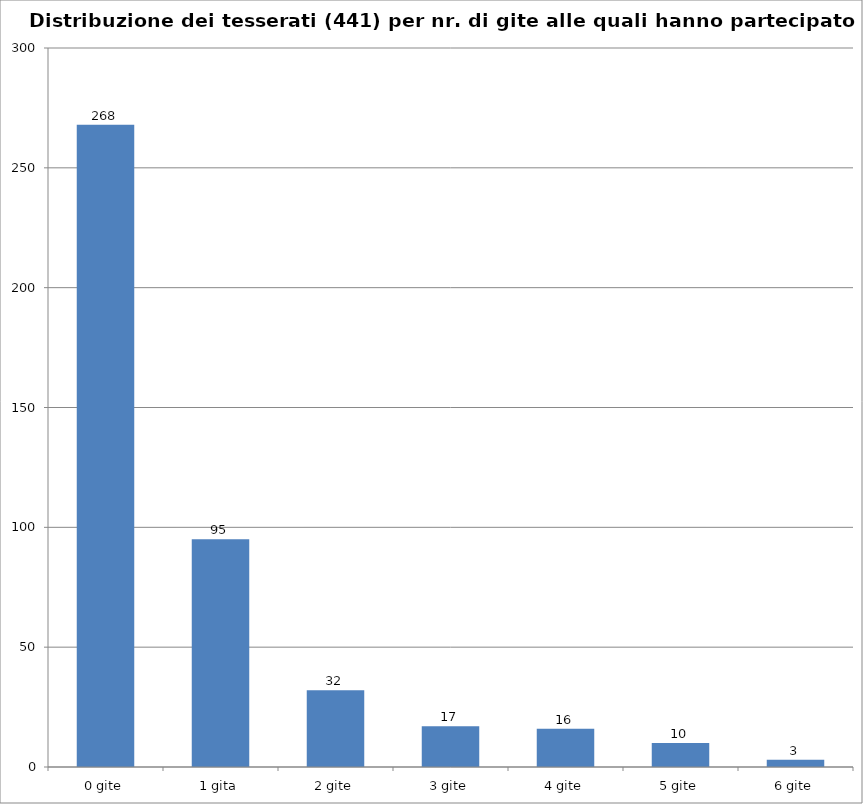
| Category | Nr. Tesserati |
|---|---|
| 0 gite | 268 |
| 1 gita | 95 |
| 2 gite | 32 |
| 3 gite | 17 |
| 4 gite | 16 |
| 5 gite | 10 |
| 6 gite | 3 |